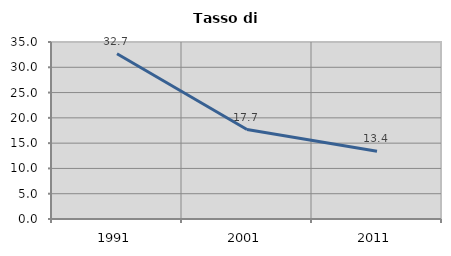
| Category | Tasso di disoccupazione   |
|---|---|
| 1991.0 | 32.69 |
| 2001.0 | 17.682 |
| 2011.0 | 13.402 |